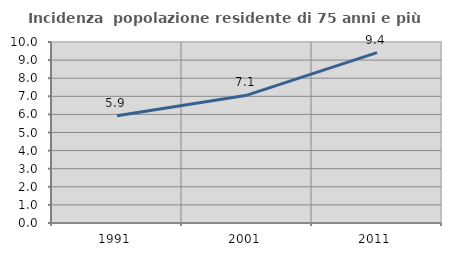
| Category | Incidenza  popolazione residente di 75 anni e più |
|---|---|
| 1991.0 | 5.929 |
| 2001.0 | 7.063 |
| 2011.0 | 9.411 |